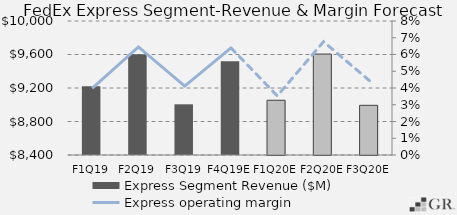
| Category | Express Segment Revenue ($M) |
|---|---|
|  F1Q19  | 9221.298 |
|  F2Q19  | 9603.601 |
|  F3Q19  | 9005.337 |
|  F4Q19E  | 9518.518 |
|  F1Q20E  | 9053.666 |
|  F2Q20E  | 9605.283 |
|  F3Q20E  | 8993.17 |